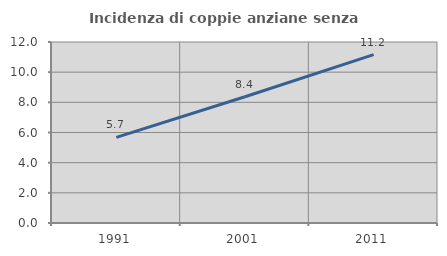
| Category | Incidenza di coppie anziane senza figli  |
|---|---|
| 1991.0 | 5.676 |
| 2001.0 | 8.372 |
| 2011.0 | 11.166 |